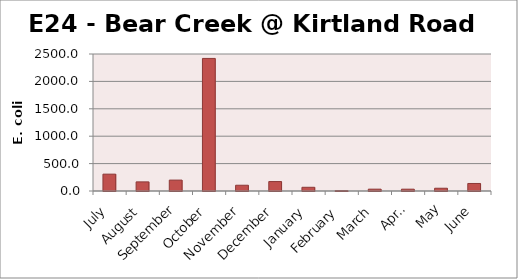
| Category | E. coli MPN |
|---|---|
| July | 307.6 |
| August | 166.4 |
| September | 198.9 |
| October | 2419.2 |
| November | 105 |
| December | 172.5 |
| January | 67.6 |
| February | 5.2 |
| March | 33.6 |
| April | 33.3 |
| May | 50.4 |
| June | 137.4 |